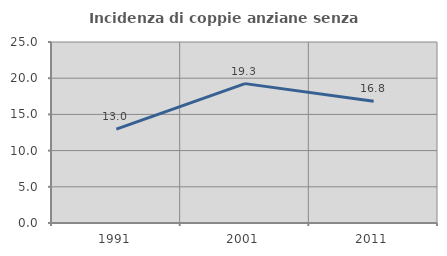
| Category | Incidenza di coppie anziane senza figli  |
|---|---|
| 1991.0 | 12.977 |
| 2001.0 | 19.251 |
| 2011.0 | 16.826 |